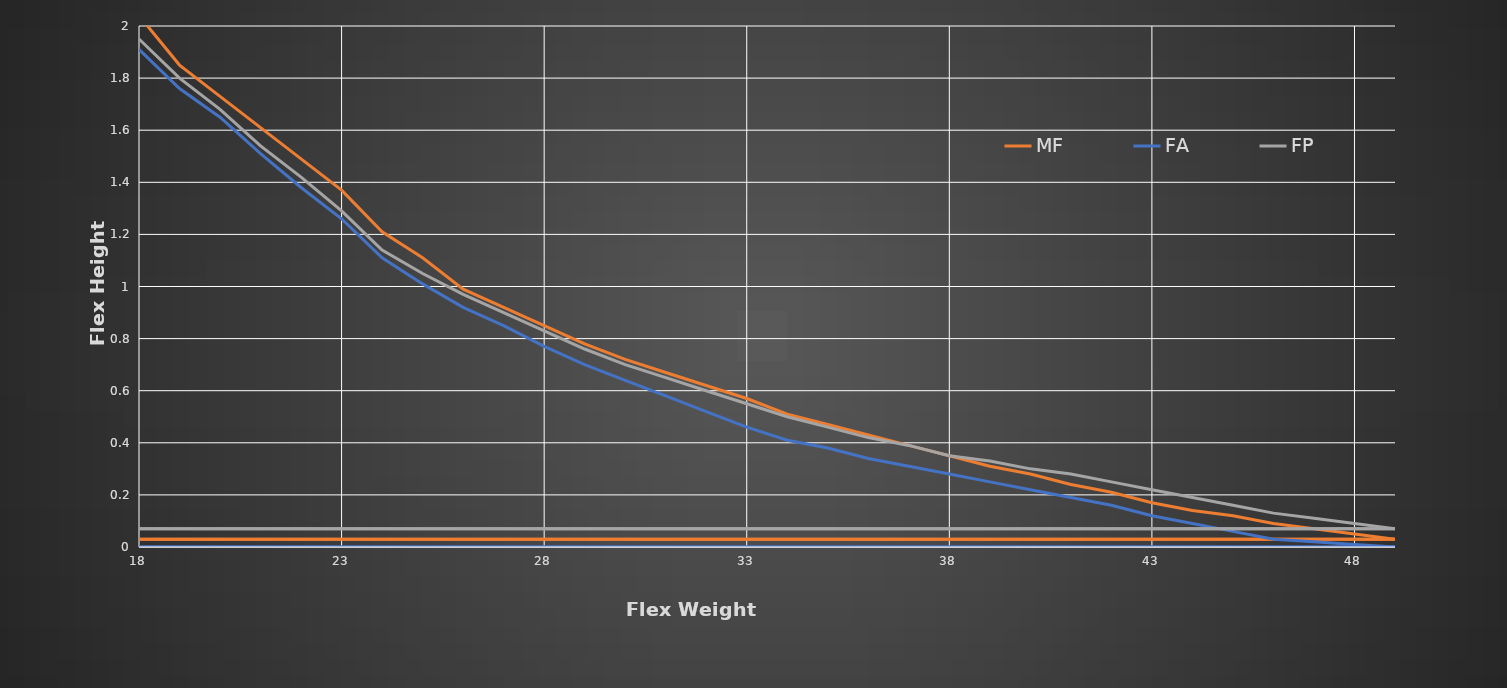
| Category | MF | FA | FP |
|---|---|---|---|
| 18.0 | 2.04 | 1.91 | 1.95 |
| 19.0 | 1.85 | 1.76 | 1.8 |
| 20.0 | 1.73 | 1.65 | 1.68 |
| 21.0 | 1.61 | 1.51 | 1.54 |
| 22.0 | 1.49 | 1.38 | 1.42 |
| 23.0 | 1.37 | 1.26 | 1.29 |
| 24.0 | 1.21 | 1.11 | 1.14 |
| 25.0 | 1.11 | 1.01 | 1.05 |
| 26.0 | 0.99 | 0.92 | 0.97 |
| 27.0 | 0.92 | 0.85 | 0.9 |
| 28.0 | 0.85 | 0.77 | 0.83 |
| 29.0 | 0.78 | 0.7 | 0.76 |
| 30.0 | 0.72 | 0.64 | 0.7 |
| 31.0 | 0.67 | 0.58 | 0.65 |
| 32.0 | 0.62 | 0.52 | 0.6 |
| 33.0 | 0.57 | 0.46 | 0.55 |
| 34.0 | 0.51 | 0.41 | 0.5 |
| 35.0 | 0.47 | 0.38 | 0.46 |
| 36.0 | 0.43 | 0.34 | 0.42 |
| 37.0 | 0.39 | 0.31 | 0.39 |
| 38.0 | 0.35 | 0.28 | 0.35 |
| 39.0 | 0.31 | 0.25 | 0.33 |
| 40.0 | 0.28 | 0.22 | 0.3 |
| 41.0 | 0.24 | 0.19 | 0.28 |
| 42.0 | 0.21 | 0.16 | 0.25 |
| 43.0 | 0.17 | 0.12 | 0.22 |
| 44.0 | 0.14 | 0.09 | 0.19 |
| 45.0 | 0.12 | 0.06 | 0.16 |
| 46.0 | 0.09 | 0.03 | 0.13 |
| 47.0 | 0.07 | 0.02 | 0.11 |
| 48.0 | 0.05 | 0.01 | 0.09 |
| 49.0 | 0.03 | 0 | 0.07 |
| nan | 0 | 0 | 0 |
| nan | 0 | 0 | 0 |
| nan | 0 | 0 | 0 |
| nan | 0 | 0 | 0 |
| nan | 0 | 0 | 0 |
| nan | 0 | 0 | 0 |
| nan | 0 | 0 | 0 |
| nan | 0 | 0 | 0 |
| nan | 0 | 0 | 0 |
| nan | 0 | 0 | 0 |
| nan | 0 | 0 | 0 |
| nan | 0 | 0 | 0 |
| nan | 0 | 0 | 0 |
| nan | 0 | 0 | 0 |
| nan | 0 | 0 | 0 |
| nan | 0 | 0 | 0 |
| nan | 0 | 0 | 0 |
| nan | 0 | 0 | 0 |
| nan | 0 | 0 | 0 |
| nan | 0 | 0 | 0 |
| nan | 0 | 0 | 0 |
| nan | 0 | 0 | 0 |
| nan | 0 | 0 | 0 |
| nan | 0 | 0 | 0 |
| nan | 0 | 0 | 0 |
| nan | 0 | 0 | 0 |
| nan | 0 | 0 | 0 |
| nan | 0 | 0 | 0 |
| nan | 0 | 0 | 0 |
| nan | 0 | 0 | 0 |
| nan | 0 | 0 | 0 |
| nan | 0 | 0 | 0 |
| nan | 0 | 0 | 0 |
| nan | 0 | 0 | 0 |
| nan | 0 | 0 | 0 |
| nan | 0 | 0 | 0 |
| nan | 0 | 0 | 0 |
| nan | 0 | 0 | 0 |
| nan | 0 | 0 | 0 |
| nan | 0 | 0 | 0 |
| nan | 0 | 0 | 0 |
| nan | 0 | 0 | 0 |
| nan | 0 | 0 | 0 |
| nan | 0 | 0 | 0 |
| nan | 0 | 0 | 0 |
| nan | 0 | 0 | 0 |
| nan | 0 | 0 | 0 |
| nan | 0 | 0 | 0 |
| nan | 0 | 0 | 0 |
| nan | 0 | 0 | 0 |
| nan | 0 | 0 | 0 |
| nan | 0 | 0 | 0 |
| nan | 0 | 0 | 0 |
| nan | 0 | 0 | 0 |
| nan | 0 | 0 | 0 |
| nan | 0 | 0 | 0 |
| nan | 0 | 0 | 0 |
| nan | 0 | 0 | 0 |